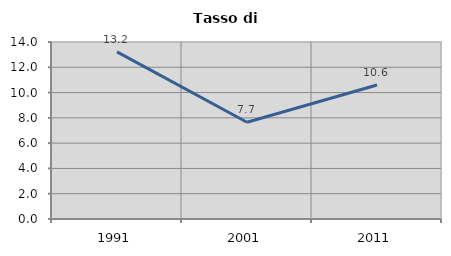
| Category | Tasso di disoccupazione   |
|---|---|
| 1991.0 | 13.222 |
| 2001.0 | 7.656 |
| 2011.0 | 10.596 |